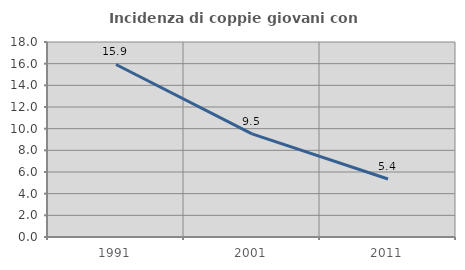
| Category | Incidenza di coppie giovani con figli |
|---|---|
| 1991.0 | 15.925 |
| 2001.0 | 9.513 |
| 2011.0 | 5.353 |